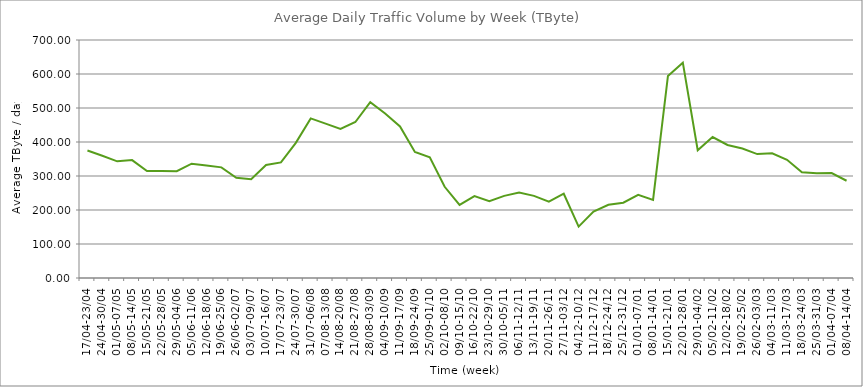
| Category | Average |
|---|---|
| 17/04-23/04 | 375.18 |
| 24/04-30/04 | 359.7 |
| 01/05-07/05 | 343.17 |
| 08/05-14/05 | 346.83 |
| 15/05-21/05 | 314.47 |
| 22/05-28/05 | 314.93 |
| 29/05-04/06 | 314.29 |
| 05/06-11/06 | 336.21 |
| 12/06-18/06 | 331.23 |
| 19/06-25/06 | 325.41 |
| 26/06-02/07 | 294.9 |
| 03/07-09/07 | 290.67 |
| 10/07-16/07 | 332.63 |
| 17/07-23/07 | 339.9 |
| 24/07-30/07 | 397.4 |
| 31/07-06/08 | 469.48 |
| 07/08-13/08 | 453.96 |
| 14/08-20/08 | 438.69 |
| 21/08-27/08 | 458.79 |
| 28/08-03/09 | 516.85 |
| 04/09-10/09 | 484.06 |
| 11/09-17/09 | 445.66 |
| 18/09-24/09 | 370.61 |
| 25/09-01/10 | 354.76 |
| 02/10-08/10 | 268.29 |
| 09/10-15/10 | 215.13 |
| 16/10-22/10 | 240.71 |
| 23/10-29/10 | 225.91 |
| 30/10-05/11 | 241.54 |
| 06/11-12/11 | 251.5 |
| 13/11-19/11 | 241.48 |
| 20/11-26/11 | 224.43 |
| 27/11-03/12 | 247.86 |
| 04/12-10/12 | 151.2 |
| 11/12-17/12 | 195.44 |
| 18/12-24/12 | 215.45 |
| 25/12-31/12 | 221.47 |
| 01/01-07/01 | 244.73 |
| 08/01-14/01 | 229.87 |
| 15/01-21/01 | 594.13 |
| 22/01-28/01 | 633.39 |
| 29/01-04/02 | 375.75 |
| 05/02-11/02 | 414.66 |
| 12/02-18/02 | 391.25 |
| 19/02-25/02 | 381 |
| 26/02-03/03 | 364.39 |
| 04/03-11/03 | 366.88 |
| 11/03-17/03 | 347.61 |
| 18/03-24/03 | 311.26 |
| 25/03-31/03 | 308.23 |
| 01/04-07/04 | 308.47 |
| 08/04-14/04 | 286.05 |